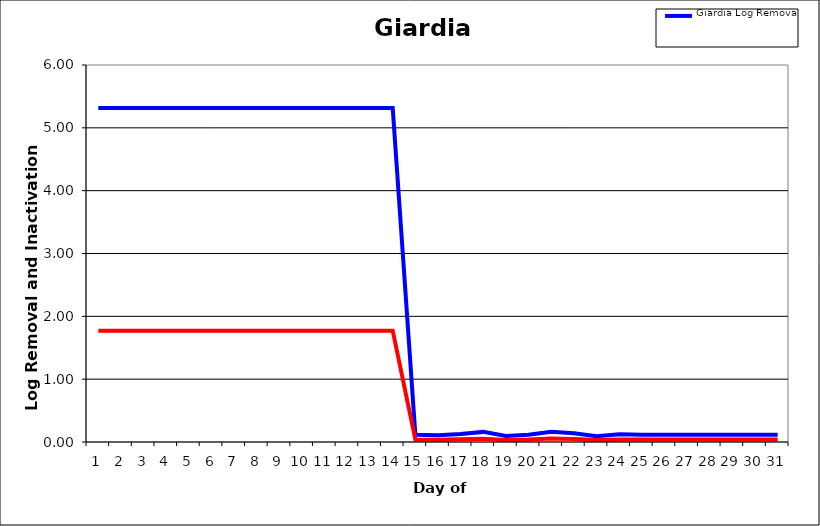
| Category | Giardia Log Removal | Giardia Inactivation Ratio |
|---|---|---|
| 1.0 | 5.314 | 1.771 |
| 2.0 | 5.314 | 1.771 |
| 3.0 | 5.314 | 1.771 |
| 4.0 | 5.314 | 1.771 |
| 5.0 | 5.314 | 1.771 |
| 6.0 | 5.314 | 1.771 |
| 7.0 | 5.314 | 1.771 |
| 8.0 | 5.314 | 1.771 |
| 9.0 | 5.314 | 1.771 |
| 10.0 | 5.314 | 1.771 |
| 11.0 | 5.314 | 1.771 |
| 12.0 | 5.314 | 1.771 |
| 13.0 | 5.314 | 1.771 |
| 14.0 | 5.314 | 1.771 |
| 15.0 | 0.116 | 0.039 |
| 16.0 | 0.107 | 0.036 |
| 17.0 | 0.126 | 0.042 |
| 18.0 | 0.161 | 0.054 |
| 19.0 | 0.095 | 0.032 |
| 20.0 | 0.114 | 0.038 |
| 21.0 | 0.162 | 0.054 |
| 22.0 | 0.139 | 0.046 |
| 23.0 | 0.09 | 0.03 |
| 24.0 | 0.124 | 0.041 |
| 25.0 | 0.116 | 0.039 |
| 26.0 | 0.116 | 0.039 |
| 27.0 | 0.116 | 0.039 |
| 28.0 | 0.116 | 0.039 |
| 29.0 | 0.116 | 0.039 |
| 30.0 | 0.116 | 0.039 |
| 31.0 | 0.116 | 0.039 |